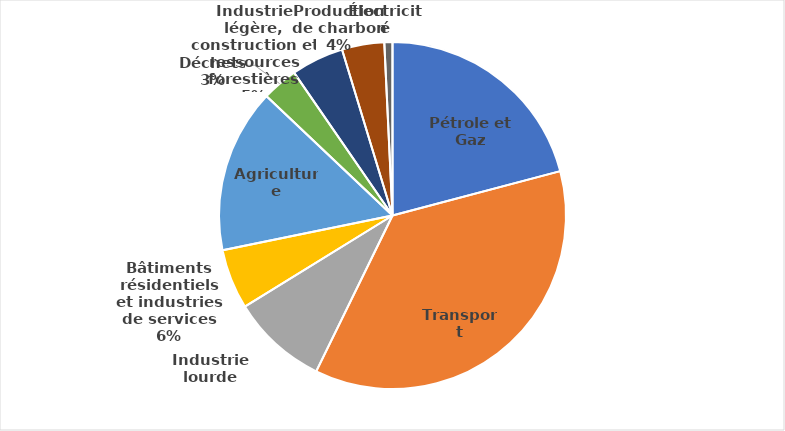
| Category | Series 0 |
|---|---|
| Pétrole et Gaz | 12.411 |
| Transport | 21.613 |
| Industrie lourde | 5.321 |
| Bâtiments résidentiels et industries de services | 3.322 |
| Agriculture | 9.082 |
| Déchets | 1.978 |
| Industrie légère, construction et ressources forestières | 2.914 |
| Production de charbon | 2.345 |
| Électricité | 0.449 |